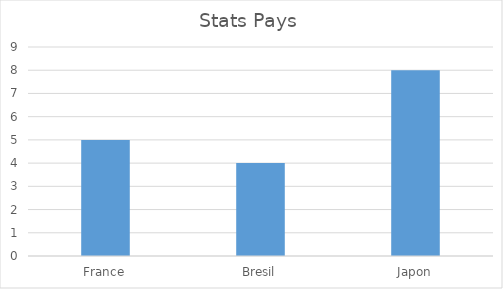
| Category | Series 0 |
|---|---|
| France | 5 |
| Bresil | 4 |
| Japon | 8 |